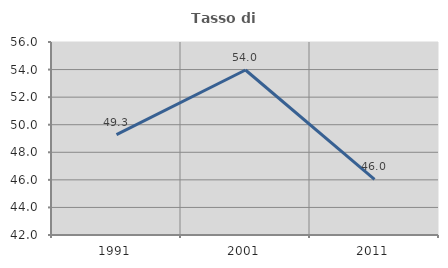
| Category | Tasso di occupazione   |
|---|---|
| 1991.0 | 49.286 |
| 2001.0 | 53.968 |
| 2011.0 | 46.037 |